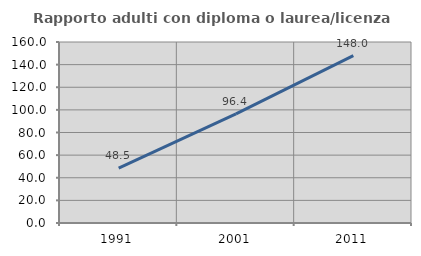
| Category | Rapporto adulti con diploma o laurea/licenza media  |
|---|---|
| 1991.0 | 48.534 |
| 2001.0 | 96.407 |
| 2011.0 | 147.965 |